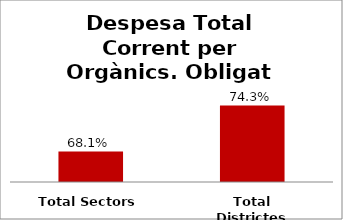
| Category | Series 0 |
|---|---|
| Total Sectors | 0.681 |
| Total Districtes | 0.743 |